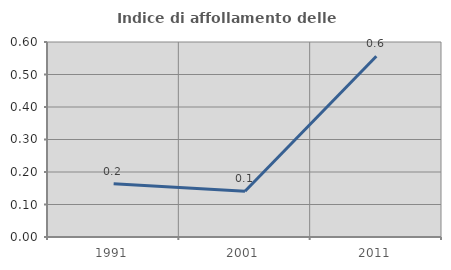
| Category | Indice di affollamento delle abitazioni  |
|---|---|
| 1991.0 | 0.164 |
| 2001.0 | 0.141 |
| 2011.0 | 0.556 |